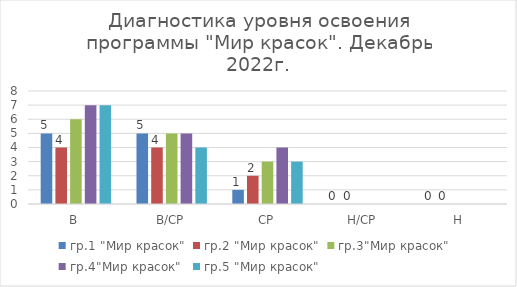
| Category | гр.1 "Мир красок" | гр.2 "Мир красок" | гр.3"Мир красок" | гр.4"Мир красок" | гр.5 "Мир красок" |
|---|---|---|---|---|---|
| В | 5 | 4 | 6 | 7 | 7 |
| В/СР | 5 | 4 | 5 | 5 | 4 |
| СР | 1 | 2 | 3 | 4 | 3 |
| Н/СР | 0 | 0 | 0 | 0 | 0 |
| Н | 0 | 0 | 0 | 0 | 0 |